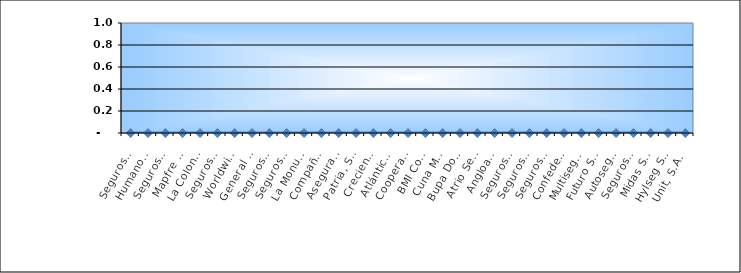
| Category | Series 0 |
|---|---|
| Seguros Universal, S. A. | 0 |
| Humano Seguros, S. A. | 0 |
| Seguros Reservas, S. A. | 0 |
| Mapfre BHD Compañía de Seguros | 0 |
| La Colonial, S. A., Compañia De Seguros | 0 |
| Seguros Sura, S.A. | 0 |
| Worldwide Seguros, S. A. | 0 |
| General de Seguros, S. A. | 0 |
| Seguros Crecer, S. A. | 0 |
| Seguros Pepín, S. A. | 0 |
| La Monumental de Seguros, S. A. | 0 |
| Compañía Dominicana de Seguros, C. por A. | 0 |
| Aseguradora Agropecuaria Dominicana, S. A. | 0 |
| Patria, S. A., Compañía de Seguros | 0 |
| Creciendo Seguros | 0 |
| Atlántica Seguros, S. A. | 0 |
| Cooperativa Nacional De Seguros, Inc  | 0 |
| BMI Compañía de Seguros, S. A. | 0 |
| Cuna Mutual Insurance Society Dominicana | 0 |
| Bupa Dominicana, S. A. | 0 |
| Atrio Seguros S. A. | 0 |
| Angloamericana de Seguros, S. A. | 0 |
| Seguros La Internacional, S. A. | 0 |
| Seguros APS, S.R.L. | 0 |
| Seguros Ademi, S.A. | 0 |
| Confederación del Canadá Dominicana, S. A. | 0 |
| Multiseguros Su, S.A. | 0 |
| Futuro Seguros | 0 |
| Autoseguro, S. A. | 0 |
| Seguros Yunen, S.A. | 0 |
| Midas Seguros, S.A. | 0 |
| Hylseg Seguros S.A | 0 |
| Unit, S.A. | 0 |